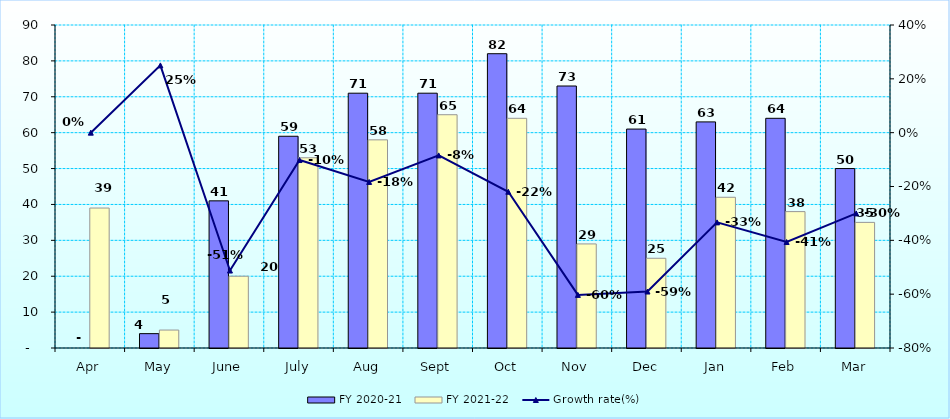
| Category | FY 2020-21 | FY 2021-22 |
|---|---|---|
| Apr | 0 | 39 |
| May | 4 | 5 |
| June | 41 | 20 |
| July | 59 | 53 |
| Aug | 71 | 58 |
| Sept | 71 | 65 |
| Oct | 82 | 64 |
| Nov | 73 | 29 |
| Dec | 61 | 25 |
| Jan | 63 | 42 |
| Feb | 64 | 38 |
| Mar | 50 | 35 |